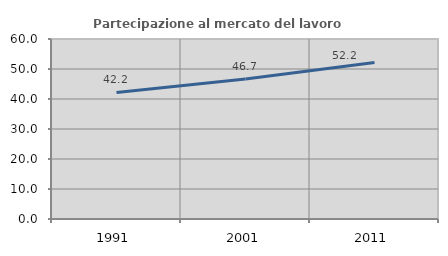
| Category | Partecipazione al mercato del lavoro  femminile |
|---|---|
| 1991.0 | 42.168 |
| 2001.0 | 46.691 |
| 2011.0 | 52.177 |